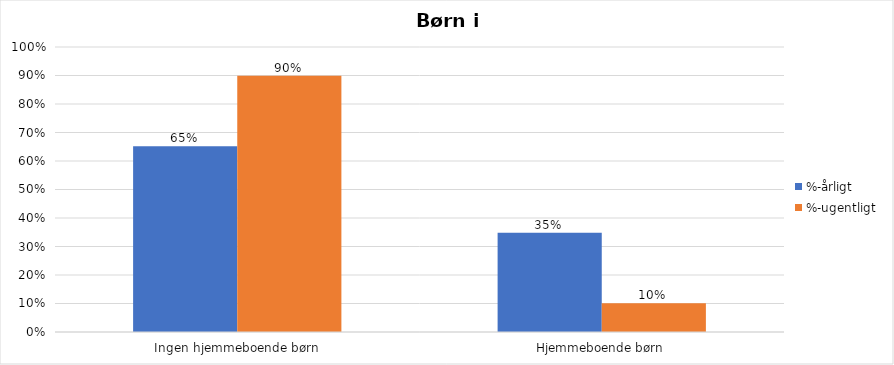
| Category | %-årligt | %-ugentligt |
|---|---|---|
| Ingen hjemmeboende børn | 0.652 | 0.899 |
| Hjemmeboende børn | 0.348 | 0.101 |